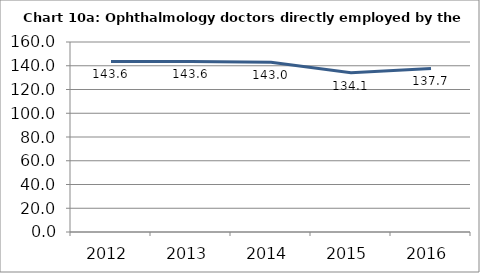
| Category | Chart 10a: Ophthalmology doctors directly employed by the NHS  |
|---|---|
| 2012.0 | 143.614 |
| 2013.0 | 143.623 |
| 2014.0 | 143.028 |
| 2015.0 | 134.141 |
| 2016.0 | 137.691 |